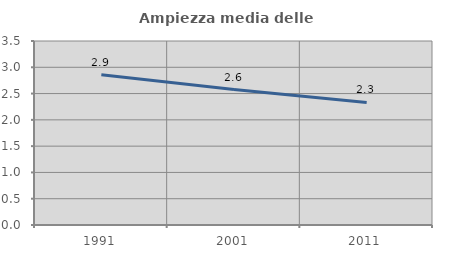
| Category | Ampiezza media delle famiglie |
|---|---|
| 1991.0 | 2.858 |
| 2001.0 | 2.575 |
| 2011.0 | 2.332 |